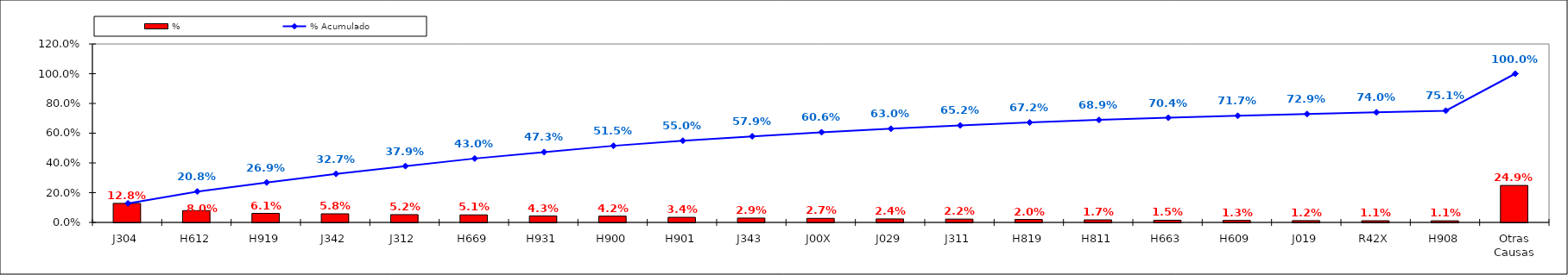
| Category | % |
|---|---|
| J304 | 0.128 |
| H612 | 0.08 |
| H919 | 0.061 |
| J342 | 0.058 |
| J312 | 0.052 |
| H669 | 0.051 |
| H931 | 0.043 |
| H900 | 0.042 |
| H901 | 0.034 |
| J343 | 0.029 |
| J00X | 0.027 |
| J029 | 0.024 |
| J311 | 0.022 |
| H819 | 0.02 |
| H811 | 0.017 |
| H663 | 0.015 |
| H609 | 0.013 |
| J019 | 0.012 |
| R42X | 0.011 |
| H908 | 0.011 |
| Otras Causas | 0.249 |